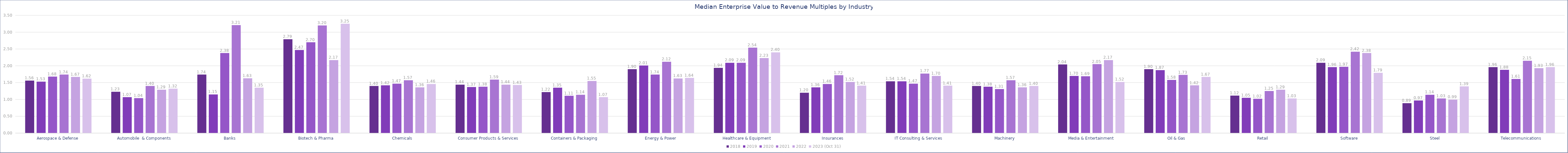
| Category | 2018 | 2019 | 2020 | 2021 | 2022 | 2023 (Oct 31) |
|---|---|---|---|---|---|---|
| Aerospace & Defense | 1.56 | 1.53 | 1.68 | 1.74 | 1.67 | 1.62 |
| Automobile  & Components | 1.23 | 1.07 | 1.04 | 1.4 | 1.29 | 1.32 |
| Banks | 1.74 | 1.15 | 2.38 | 3.21 | 1.63 | 1.35 |
| Biotech & Pharma | 2.79 | 2.47 | 2.7 | 3.2 | 2.17 | 3.25 |
| Chemicals | 1.4 | 1.42 | 1.47 | 1.57 | 1.36 | 1.46 |
| Consumer Products & Services | 1.44 | 1.37 | 1.38 | 1.59 | 1.44 | 1.43 |
| Containers & Packaging | 1.22 | 1.35 | 1.11 | 1.14 | 1.55 | 1.07 |
| Energy & Power | 1.9 | 2.01 | 1.74 | 2.12 | 1.625 | 1.64 |
| Healthcare & Equipment | 1.94 | 2.09 | 2.09 | 2.54 | 2.23 | 2.4 |
| Insurances | 1.2 | 1.36 | 1.46 | 1.72 | 1.52 | 1.41 |
| IT Consulting & Services | 1.54 | 1.54 | 1.47 | 1.77 | 1.7 | 1.41 |
| Machinery | 1.4 | 1.38 | 1.31 | 1.57 | 1.36 | 1.4 |
| Media & Entertainment | 2.04 | 1.7 | 1.69 | 2.05 | 2.17 | 1.52 |
| Oil & Gas | 1.9 | 1.87 | 1.58 | 1.73 | 1.42 | 1.67 |
| Retail | 1.115 | 1.05 | 1.02 | 1.25 | 1.29 | 1.03 |
| Software | 2.09 | 1.96 | 1.97 | 2.42 | 2.38 | 1.79 |
| Steel | 0.89 | 0.97 | 1.14 | 1.03 | 0.994 | 1.39 |
| Telecommunications | 1.96 | 1.88 | 1.61 | 2.15 | 1.93 | 1.96 |